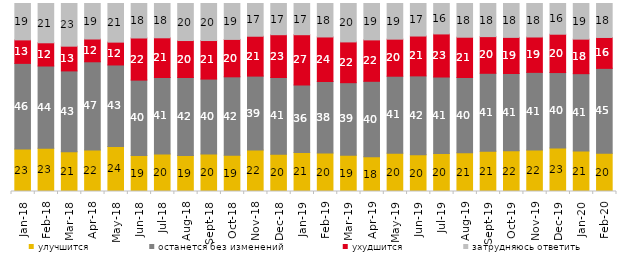
| Category | улучшится | останется без изменений | ухудшится | затрудняюсь ответить |
|---|---|---|---|---|
| 2018-01-01 | 22.55 | 45.6 | 12.5 | 19.35 |
| 2018-02-01 | 23 | 43.75 | 12.35 | 20.9 |
| 2018-03-01 | 21.15 | 43 | 13.15 | 22.7 |
| 2018-04-01 | 22.05 | 46.95 | 12.1 | 18.9 |
| 2018-05-01 | 23.95 | 43.35 | 12.15 | 20.55 |
| 2018-06-01 | 19.15 | 40.1 | 22.4 | 18.35 |
| 2018-07-01 | 19.95 | 40.7 | 21.1 | 18.25 |
| 2018-08-01 | 19.15 | 41.5 | 19.65 | 19.7 |
| 2018-09-01 | 19.95 | 39.85 | 20.5 | 19.7 |
| 2018-10-01 | 19.3 | 41.7 | 19.9 | 19.1 |
| 2018-11-01 | 22.056 | 39.321 | 21.208 | 17.415 |
| 2018-12-01 | 19.8 | 40.85 | 22.75 | 16.6 |
| 2019-01-01 | 20.75 | 35.95 | 26.7 | 16.6 |
| 2019-02-01 | 20.45 | 38.05 | 23.7 | 17.8 |
| 2019-03-01 | 19.344 | 38.538 | 21.681 | 20.438 |
| 2019-04-01 | 18.465 | 40.149 | 22.03 | 19.356 |
| 2019-05-01 | 20.406 | 40.911 | 19.713 | 18.97 |
| 2019-06-01 | 19.601 | 41.895 | 21.197 | 17.307 |
| 2019-07-01 | 20.149 | 40.743 | 22.921 | 16.188 |
| 2019-08-01 | 20.579 | 40.06 | 21.429 | 17.932 |
| 2019-09-01 | 21.386 | 41.485 | 19.505 | 17.624 |
| 2019-10-01 | 21.683 | 41.089 | 19.208 | 18.02 |
| 2019-11-01 | 22.03 | 41.337 | 18.812 | 17.822 |
| 2019-12-01 | 23.168 | 40.099 | 20.396 | 16.337 |
| 2020-01-01 | 21.485 | 41.188 | 18.366 | 18.96 |
| 2020-02-01 | 20.297 | 45.198 | 16.436 | 18.069 |